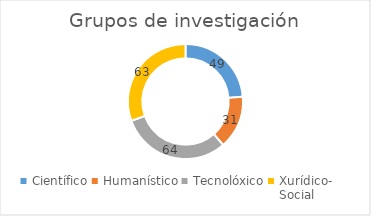
| Category | nº de grupos de investigación |
|---|---|
| Científico | 49 |
| Humanístico | 31 |
| Tecnolóxico | 64 |
| Xurídico-
Social | 63 |